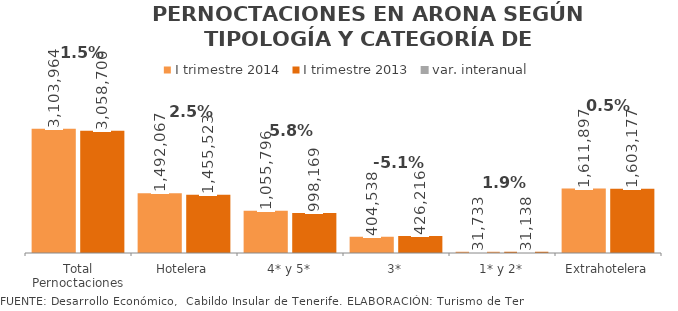
| Category | I trimestre 2014 | I trimestre 2013 |
|---|---|---|
| Total Pernoctaciones | 3103964 | 3058700 |
| Hotelera | 1492067 | 1455523 |
| 4* y 5* | 1055796 | 998169 |
| 3* | 404538 | 426216 |
| 1* y 2* | 31733 | 31138 |
| Extrahotelera | 1611897 | 1603177 |